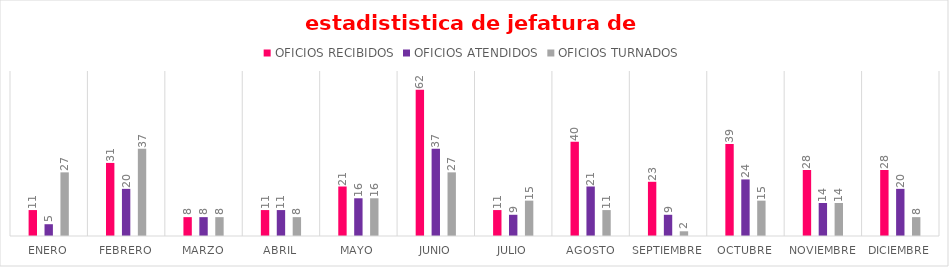
| Category | OFICIOS RECIBIDOS | OFICIOS ATENDIDOS | OFICIOS TURNADOS |
|---|---|---|---|
| ENERO | 11 | 5 | 27 |
| FEBRERO | 31 | 20 | 37 |
| MARZO | 8 | 8 | 8 |
| ABRIL | 11 | 11 | 8 |
| MAYO | 21 | 16 | 16 |
| JUNIO | 62 | 37 | 27 |
| JULIO | 11 | 9 | 15 |
| AGOSTO | 40 | 21 | 11 |
| SEPTIEMBRE | 23 | 9 | 2 |
| OCTUBRE | 39 | 24 | 15 |
| NOVIEMBRE | 28 | 14 | 14 |
| DICIEMBRE | 28 | 20 | 8 |